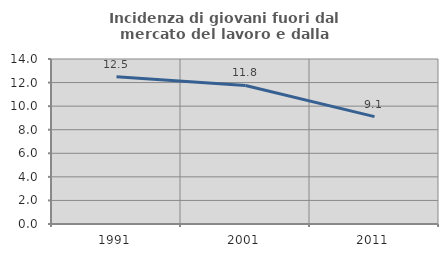
| Category | Incidenza di giovani fuori dal mercato del lavoro e dalla formazione  |
|---|---|
| 1991.0 | 12.5 |
| 2001.0 | 11.753 |
| 2011.0 | 9.109 |